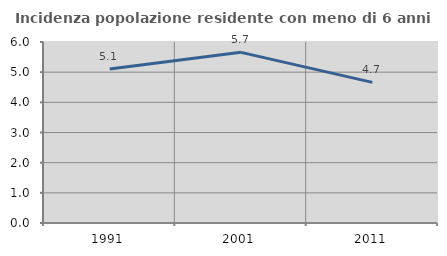
| Category | Incidenza popolazione residente con meno di 6 anni |
|---|---|
| 1991.0 | 5.106 |
| 2001.0 | 5.657 |
| 2011.0 | 4.662 |